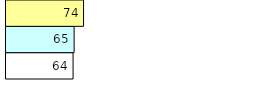
| Category | Total Standouts | Total Recd | Total Tipsters |
|---|---|---|---|
| 0 | 64 | 65 | 74 |